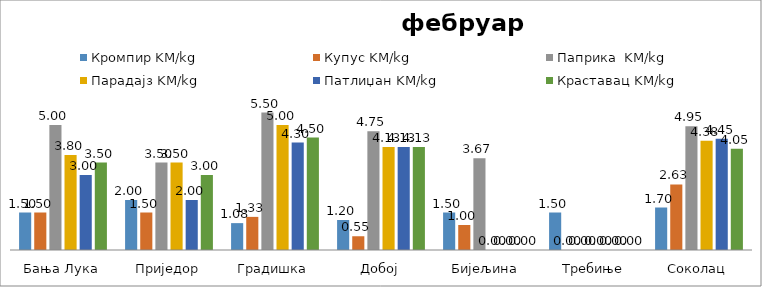
| Category | Кромпир KM/kg | Купус KM/kg | Паприка  KM/kg | Парадајз KM/kg | Патлиџан KM/kg | Краставац KM/kg |
|---|---|---|---|---|---|---|
| Бања Лука | 1.5 | 1.5 | 5 | 3.8 | 3 | 3.5 |
| Приједор | 2 | 1.5 | 3.5 | 3.5 | 2 | 3 |
| Градишка | 1.075 | 1.325 | 5.5 | 5 | 4.3 | 4.5 |
| Добој | 1.2 | 0.55 | 4.75 | 4.125 | 4.125 | 4.125 |
| Бијељина | 1.5 | 1 | 3.667 | 0 | 0 | 0 |
|  Требиње | 1.5 | 0 | 0 | 0 | 0 | 0 |
| Соколац | 1.7 | 2.625 | 4.95 | 4.375 | 4.45 | 4.05 |